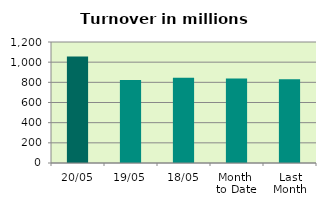
| Category | Series 0 |
|---|---|
| 20/05 | 1056.136 |
| 19/05 | 823.235 |
| 18/05 | 844.434 |
| Month 
to Date | 838.866 |
| Last
Month | 829.993 |